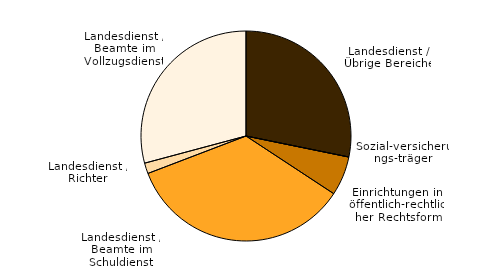
| Category | Series 0 |
|---|---|
| Landesdienst / Übrige Bereiche | 18790 |
| Sozial-versicherungs-träger | 10 |
| Einrichtungen in öffentlich-rechtlicher Rechtsform | 4025 |
| Landesdienst / Beamte im Schuldienst | 23275 |
| Landesdienst / Richter | 1090 |
| Landesdienst / Beamte im Vollzugsdienst | 19435 |